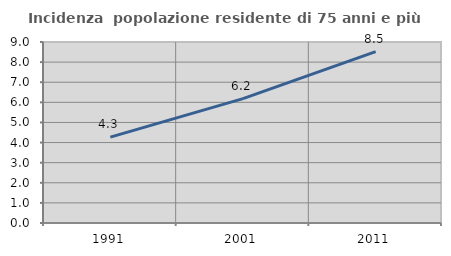
| Category | Incidenza  popolazione residente di 75 anni e più |
|---|---|
| 1991.0 | 4.27 |
| 2001.0 | 6.185 |
| 2011.0 | 8.525 |